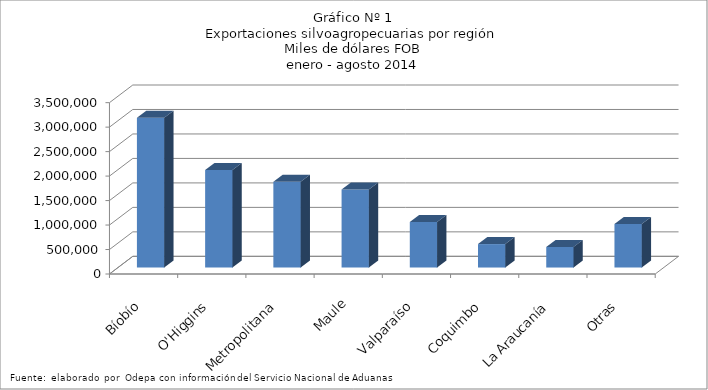
| Category | Series 0 |
|---|---|
| Bíobío | 3059960.475 |
| O'Higgins | 1991491.793 |
| Metropolitana | 1750212.959 |
| Maule | 1592486.63 |
| Valparaíso | 930748.101 |
| Coquimbo | 478935.117 |
| La Araucanía | 420399.796 |
| Otras | 887918.504 |